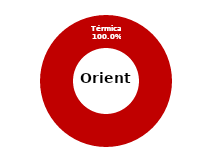
| Category | Oriente |
|---|---|
| Eólica | 0 |
| Hidráulica | 0 |
| Solar | 0 |
| Térmica | 33.251 |